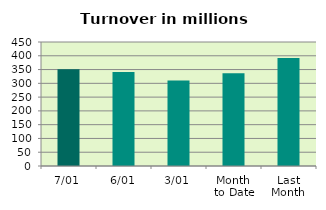
| Category | Series 0 |
|---|---|
| 7/01 | 351.306 |
| 6/01 | 341.522 |
| 3/01 | 309.97 |
| Month 
to Date | 336.583 |
| Last
Month | 391.769 |